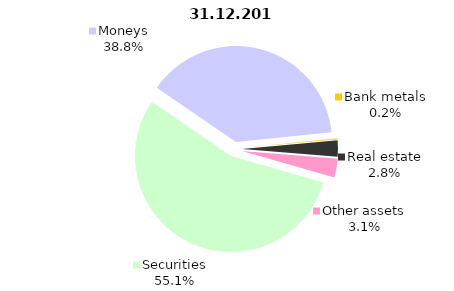
| Category | 31.12.2019 |
|---|---|
| Securities | 1725.9 |
| Moneys | 1215.5 |
| Bank metals | 5 |
| Real estate | 86.8 |
| Other assets | 98.5 |